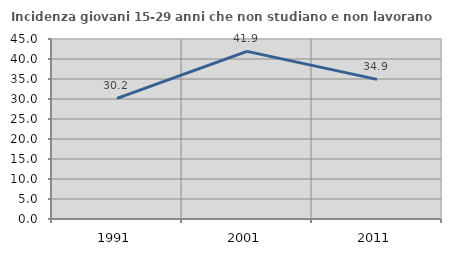
| Category | Incidenza giovani 15-29 anni che non studiano e non lavorano  |
|---|---|
| 1991.0 | 30.178 |
| 2001.0 | 41.903 |
| 2011.0 | 34.906 |